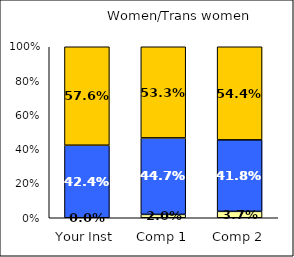
| Category | Low UG Ed Goal: Personal Development | Average UG Ed Goal: Personal Development | High UG Ed Goal: Personal Development |
|---|---|---|---|
| Your Inst | 0 | 0.424 | 0.576 |
| Comp 1 | 0.02 | 0.447 | 0.533 |
| Comp 2 | 0.037 | 0.418 | 0.544 |